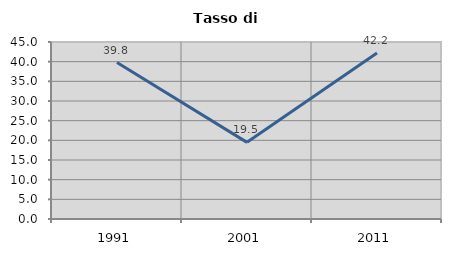
| Category | Tasso di disoccupazione   |
|---|---|
| 1991.0 | 39.785 |
| 2001.0 | 19.487 |
| 2011.0 | 42.182 |